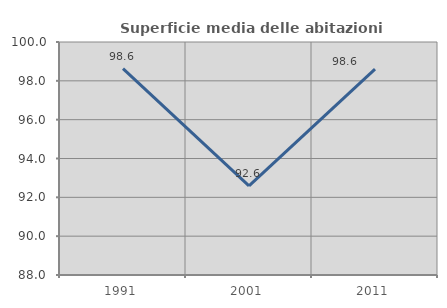
| Category | Superficie media delle abitazioni occupate |
|---|---|
| 1991.0 | 98.627 |
| 2001.0 | 92.59 |
| 2011.0 | 98.608 |